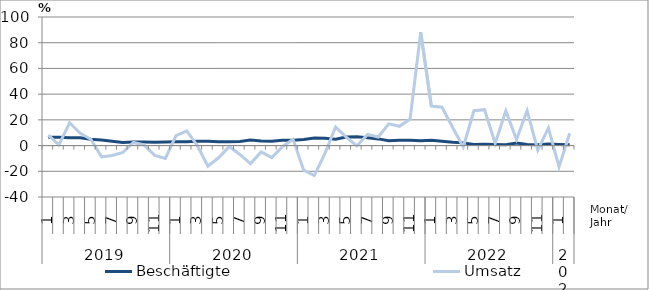
| Category | Beschäftigte | Umsatz |
|---|---|---|
| 0 | 6.4 | 8.2 |
| 1 | 6.5 | 0.6 |
| 2 | 6 | 17.8 |
| 3 | 6.1 | 9.6 |
| 4 | 4.9 | 4.9 |
| 5 | 4.3 | -8.8 |
| 6 | 3.3 | -7.7 |
| 7 | 2.4 | -5.4 |
| 8 | 2.8 | 2.4 |
| 9 | 2.7 | 0.5 |
| 10 | 2.5 | -7.6 |
| 11 | 2.7 | -10 |
| 12 | 2.9 | 7.8 |
| 13 | 2.9 | 11.5 |
| 14 | 3.4 | 0.1 |
| 15 | 3.4 | -16.1 |
| 16 | 2.9 | -9.5 |
| 17 | 2.9 | -0.8 |
| 18 | 3.1 | -6.9 |
| 19 | 4.3 | -14 |
| 20 | 3.6 | -4.9 |
| 21 | 3.4 | -9.4 |
| 22 | 4.1 | -0.9 |
| 23 | 4.1 | 4.9 |
| 24 | 4.8 | -19.1 |
| 25 | 5.8 | -23.3 |
| 26 | 5.6 | -6.1 |
| 27 | 5 | 14.4 |
| 28 | 6.6 | 6.6 |
| 29 | 6.9 | -0.3 |
| 30 | 6 | 8.7 |
| 31 | 5.2 | 6.7 |
| 32 | 3.8 | 16.9 |
| 33 | 4.2 | 15 |
| 34 | 4.2 | 20.6 |
| 35 | 3.7 | 88.1 |
| 36 | 4.1 | 30.7 |
| 37 | 3.4 | 29.8 |
| 38 | 2.6 | 14.1 |
| 39 | 2.1 | -1.1 |
| 40 | 0.9 | 27.1 |
| 41 | 1 | 27.9 |
| 42 | 0.8 | 1.7 |
| 43 | 0.7 | 27 |
| 44 | 2 | 4.7 |
| 45 | 0.9 | 27.1 |
| 46 | 0.7 | -3.6 |
| 47 | 1.3 | 13.7 |
| 48 | 0.9 | -16.6 |
| 49 | 0.6 | 9.6 |